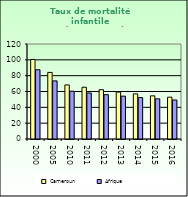
| Category | Cameroun | Afrique                        |
|---|---|---|
| 2000.0 | 100.5 | 87.462 |
| 2005.0 | 84.1 | 73.418 |
| 2010.0 | 68.3 | 60.345 |
| 2011.0 | 65.4 | 58.107 |
| 2012.0 | 62.3 | 56.032 |
| 2013.0 | 59.3 | 54.131 |
| 2014.0 | 57 | 52.336 |
| 2015.0 | 54.5 | 50.754 |
| 2016.0 | 52.8 | 49.283 |